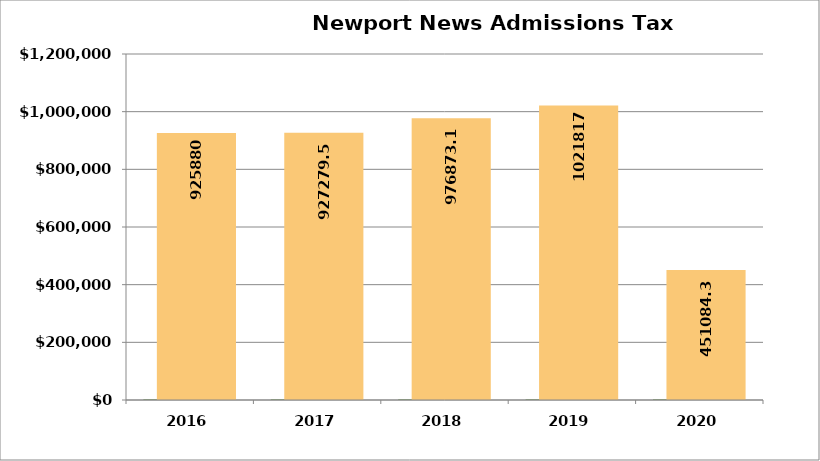
| Category | Series 0 | Series 1 |
|---|---|---|
| 2016.0 | 2016 | 925880 |
| 2017.0 | 2017 | 927279.57 |
| 2018.0 | 2018 | 976873.13 |
| 2019.0 | 2019 | 1021817 |
| 2020.0 | 2020 | 451084.38 |